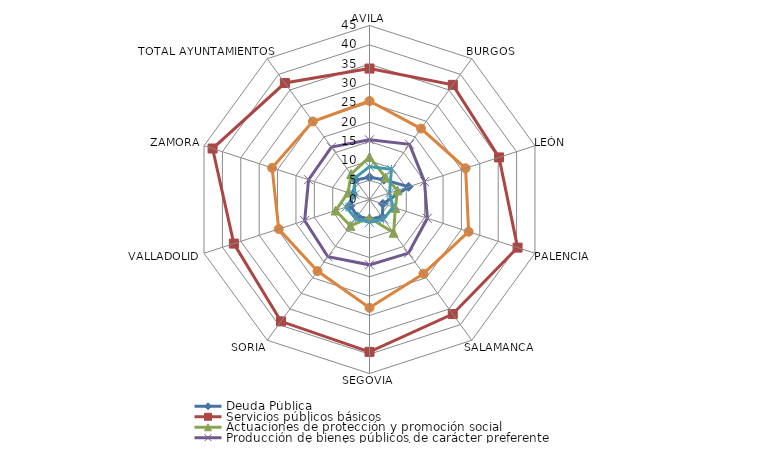
| Category | Deuda Pública | Servicios públicos básicos | Actuaciones de protección y promoción social | Producción de bienes públicos de carácter preferente | Actuaciones de carácter económico | Actuaciones de carácter general |
|---|---|---|---|---|---|---|
| AVILA | 5.731 | 33.866 | 10.992 | 15.442 | 8.5 | 25.469 |
| BURGOS | 6.328 | 36.652 | 7.061 | 17.636 | 9.644 | 22.679 |
| LEÓN | 10.624 | 35.224 | 7.616 | 14.951 | 5.463 | 26.122 |
| PALENCIA | 3.637 | 40.265 | 7.03 | 15.738 | 6.365 | 26.964 |
| SALAMANCA | 5.645 | 36.623 | 10.625 | 17.14 | 6.242 | 23.725 |
| SEGOVIA | 5.043 | 39.401 | 4.727 | 16.897 | 5.924 | 28.007 |
| SORIA | 5.377 | 38.955 | 8.419 | 18.292 | 6.076 | 22.881 |
| VALLADOLID | 5.195 | 36.891 | 9.198 | 17.637 | 6.392 | 24.687 |
| ZAMORA | 4.465 | 42.668 | 5.8 | 16.561 | 4.012 | 26.493 |
| TOTAL AYUNTAMIENTOS | 6.238 | 37.237 | 8.122 | 16.74 | 6.72 | 24.943 |